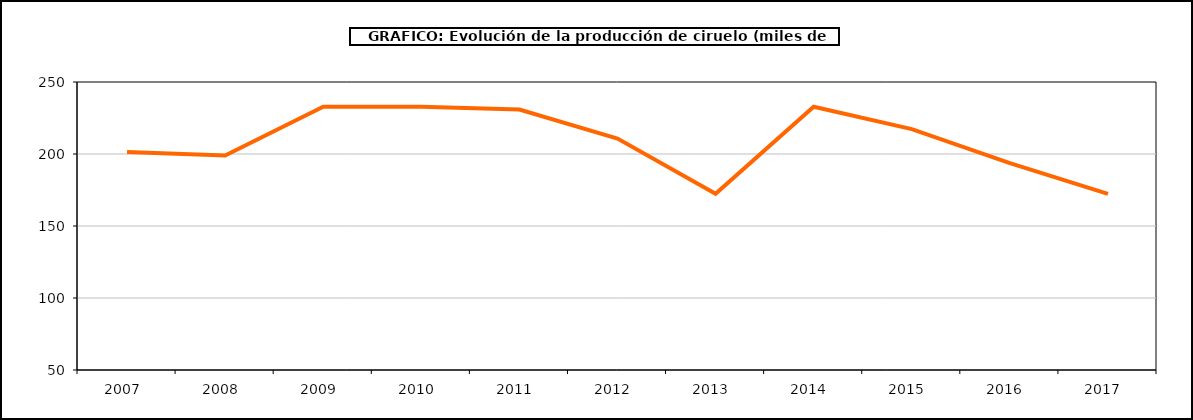
| Category | producción Ciruelo |
|---|---|
| 2007.0 | 201.392 |
| 2008.0 | 198.948 |
| 2009.0 | 232.78 |
| 2010.0 | 232.78 |
| 2011.0 | 230.877 |
| 2012.0 | 210.726 |
| 2013.0 | 172.352 |
| 2014.0 | 232.831 |
| 2015.0 | 217.291 |
| 2016.0 | 193.598 |
| 2017.0 | 172.325 |